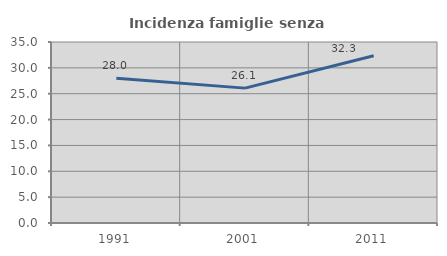
| Category | Incidenza famiglie senza nuclei |
|---|---|
| 1991.0 | 27.971 |
| 2001.0 | 26.081 |
| 2011.0 | 32.329 |